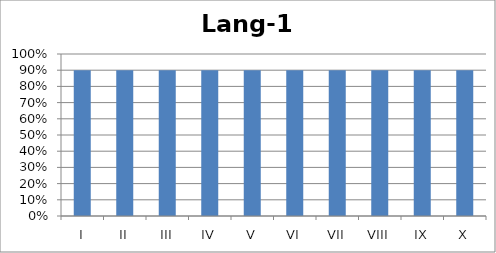
| Category | Lang-1 |
|---|---|
| I | 0.9 |
| II | 0.9 |
| III | 0.9 |
| IV | 0.9 |
| V | 0.9 |
| VI | 0.9 |
| VII | 0.9 |
| VIII | 0.9 |
| IX | 0.9 |
| X | 0.9 |